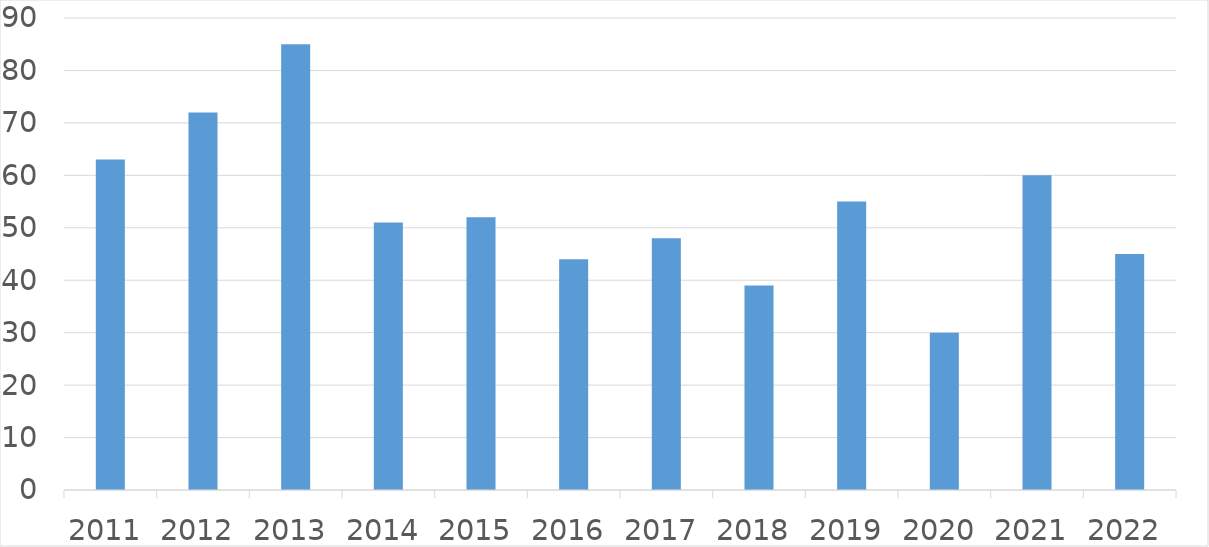
| Category | Series 0 |
|---|---|
| 2011 | 63 |
| 2012 | 72 |
| 2013 | 85 |
| 2014 | 51 |
| 2015 | 52 |
| 2016 | 44 |
| 2017 | 48 |
| 2018 | 39 |
| 2019 | 55 |
| 2020 | 30 |
| 2021 | 60 |
| 2022 | 45 |